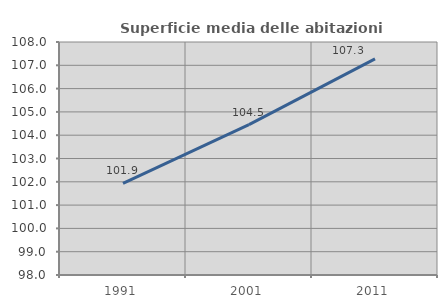
| Category | Superficie media delle abitazioni occupate |
|---|---|
| 1991.0 | 101.928 |
| 2001.0 | 104.453 |
| 2011.0 | 107.277 |